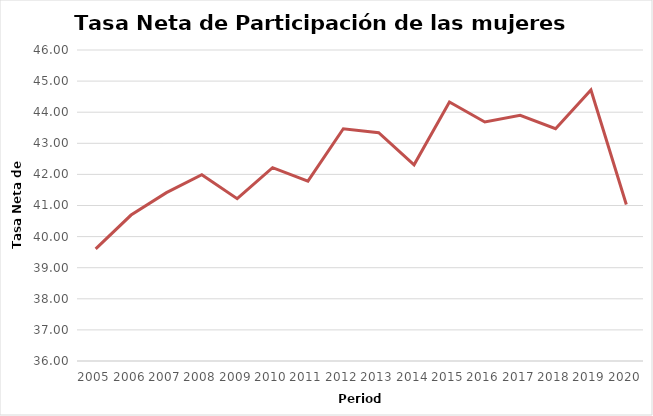
| Category | Mujeres |
|---|---|
| 2005.0 | 39.605 |
| 2006.0 | 40.693 |
| 2007.0 | 41.413 |
| 2008.0 | 41.989 |
| 2009.0 | 41.219 |
| 2010.0 | 42.215 |
| 2011.0 | 41.782 |
| 2012.0 | 43.469 |
| 2013.0 | 43.342 |
| 2014.0 | 42.309 |
| 2015.0 | 44.327 |
| 2016.0 | 43.684 |
| 2017.0 | 43.898 |
| 2018.0 | 43.469 |
| 2019.0 | 44.715 |
| 2020.0 | 41.031 |